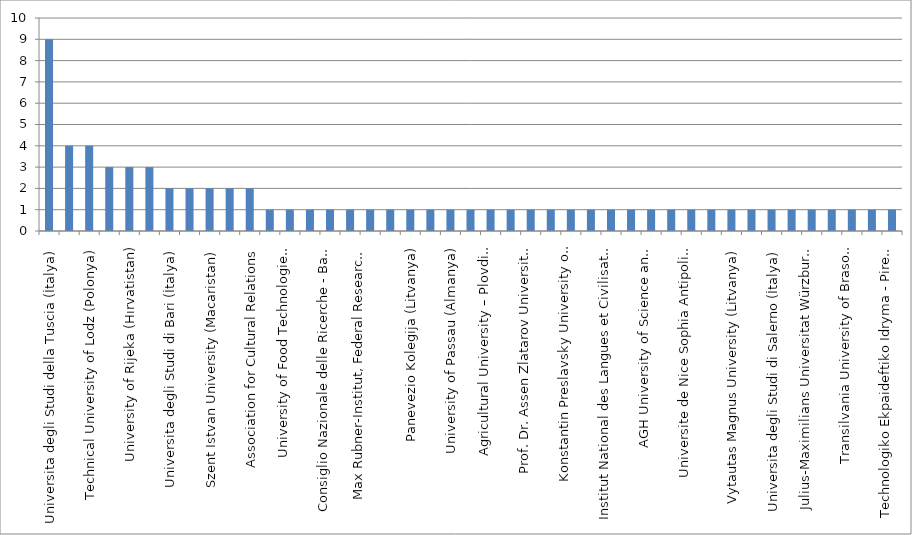
| Category | Series 0 |
|---|---|
| Universita degli Studi della Tuscia (İtalya) | 9 |
| University of Thessaly (Yunanistan) | 4 |
| Technical University of Lodz (Polonya) | 4 |
| Instituto Politecnico de Leiria (Portekiz) | 3 |
| University of Rijeka (Hırvatistan) | 3 |
| Matej Bel University (Slovakya) | 3 |
| Universita degli Studi di Bari (İtalya) | 2 |
| University of Ljubljana (Slovenya) | 2 |
| Szent Istvan University (Macaristan) | 2 |
| Esterhazy Karoly College (Macaristan) | 2 |
| Association for Cultural Relations | 2 |
| Instituto Politecnico de Coimbra (Portekiz) | 1 |
| University of Food Technologies (Bulgaristan) | 1 |
| Kaunas University of Technology (Litvanya) | 1 |
| Consiglio Nazionale delle Ricerche - Bari (İtalya) | 1 |
| Mehrsprachige Nordstadt Bibliothek (Almanya) | 1 |
| Max Rubner-Institut, Federal Research Institute for Nutrition and Food (Almanya) | 1 |
| Isad Istituto Superiore Di Architettura E Design (İtalya) | 1 |
| Panevezio Kolegija (Litvanya) | 1 |
| Ponzan University of Technology (Polonya)  | 1 |
| University of Passau (Almanya) | 1 |
| Technical University of Crete (Yunanistan) | 1 |
| Agricultural University – Plovdiv (Bulgaristan) | 1 |
| Slovak Academy of Sciences (Slovakya) | 1 |
| Prof. Dr. Assen Zlatarov University (Bulgaristan) | 1 |
| Powislanski College (Polonya) | 1 |
| Konstantin Preslavsky University of Shumen (Bulgaristan) | 1 |
| Universitatea Ovidius Din Constanta (Romanya) | 1 |
| Institut National des Langues et Civilisations Orientales (INALCO) (Fransa) | 1 |
| Universidad Politecnic de Madrid (İspanya) | 1 |
| AGH University of Science and Technology (Polonya) | 1 |
| University of Latvia (Letonya) | 1 |
| Universite de Nice Sophia Antipolis (Fransa) | 1 |
| Aristotle University of Thessaloniki (Yunanistan) | 1 |
| Vytautas Magnus University (Litvanya) | 1 |
| University of Pisa (İtalya) | 1 |
| Universita degli Studi di Salerno (İtalya) | 1 |
| Charles University (Çek Cumhuriyeti) | 1 |
| Julius-Maximilians Universitat Würzburg (Almanya) | 1 |
| Nederlandse Islamitische Federatie (Hollanda) | 1 |
| Transilvania University of Brasov (Romanya) | 1 |
| Goethe Universität Frankfurt Am Mein (Almanya) | 1 |
| Technologiko Ekpaideftiko Idryma - Pirea T.E.I. (Yunanistan) | 1 |